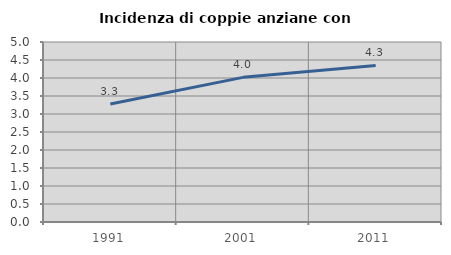
| Category | Incidenza di coppie anziane con figli |
|---|---|
| 1991.0 | 3.279 |
| 2001.0 | 4.018 |
| 2011.0 | 4.348 |